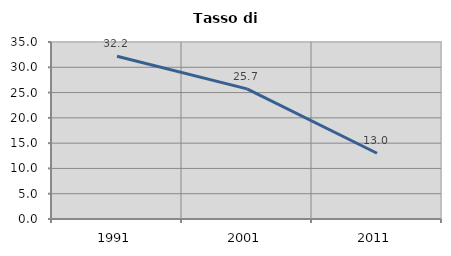
| Category | Tasso di disoccupazione   |
|---|---|
| 1991.0 | 32.193 |
| 2001.0 | 25.726 |
| 2011.0 | 12.997 |